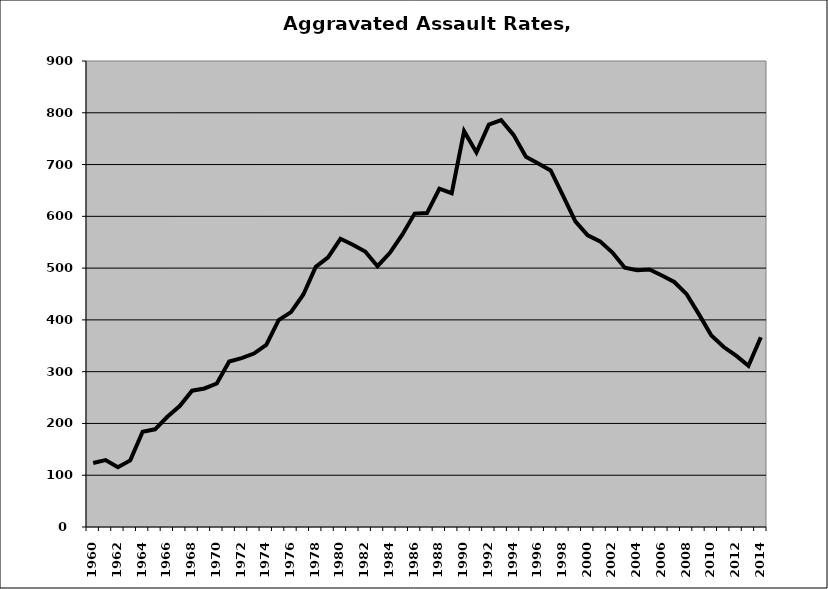
| Category | Aggravated Assault |
|---|---|
| 1960.0 | 123.719 |
| 1961.0 | 129.357 |
| 1962.0 | 115.296 |
| 1963.0 | 128.662 |
| 1964.0 | 184.102 |
| 1965.0 | 188.648 |
| 1966.0 | 212.978 |
| 1967.0 | 233.628 |
| 1968.0 | 263.312 |
| 1969.0 | 267.532 |
| 1970.0 | 277.18 |
| 1971.0 | 319.727 |
| 1972.0 | 325.982 |
| 1973.0 | 335.022 |
| 1974.0 | 351.755 |
| 1975.0 | 399.581 |
| 1976.0 | 414.963 |
| 1977.0 | 449.124 |
| 1978.0 | 502.467 |
| 1979.0 | 520.587 |
| 1980.0 | 556.636 |
| 1981.0 | 545.023 |
| 1982.0 | 531.999 |
| 1983.0 | 503.717 |
| 1984.0 | 529.565 |
| 1985.0 | 564.535 |
| 1986.0 | 605.293 |
| 1987.0 | 606.305 |
| 1988.0 | 653.284 |
| 1989.0 | 644.645 |
| 1990.0 | 764.435 |
| 1991.0 | 723.409 |
| 1992.0 | 777.187 |
| 1993.0 | 785.723 |
| 1994.0 | 757.393 |
| 1995.0 | 715.107 |
| 1996.0 | 702.236 |
| 1997.0 | 688.727 |
| 1998.0 | 639.897 |
| 1999.0 | 590.461 |
| 2000.0 | 563.17 |
| 2001.0 | 551.696 |
| 2002.0 | 530.06 |
| 2003.0 | 500.648 |
| 2004.0 | 495.812 |
| 2005.0 | 497.186 |
| 2006.0 | 485.636 |
| 2007.0 | 473.25 |
| 2008.0 | 449.688 |
| 2009.0 | 410.574 |
| 2010.0 | 369.777 |
| 2011.0 | 347.543 |
| 2012.0 | 330.883 |
| 2013.0 | 311.495 |
| 2014.0 | 366.43 |